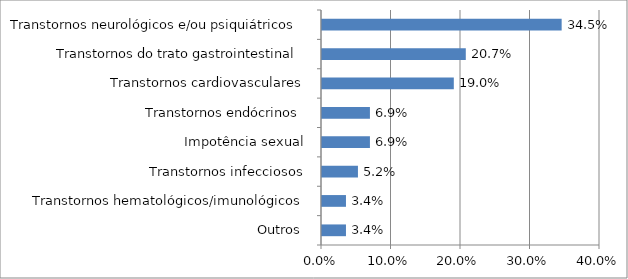
| Category | Series 0 |
|---|---|
| Outros  | 0.034 |
| Transtornos hematológicos/imunológicos | 0.034 |
| Transtornos infecciosos | 0.052 |
| Impotência sexual | 0.069 |
| Transtornos endócrinos  | 0.069 |
| Transtornos cardiovasculares | 0.19 |
| Transtornos do trato gastrointestinal  | 0.207 |
| Transtornos neurológicos e/ou psiquiátricos  | 0.345 |